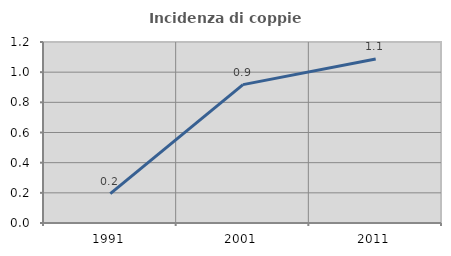
| Category | Incidenza di coppie miste |
|---|---|
| 1991.0 | 0.195 |
| 2001.0 | 0.917 |
| 2011.0 | 1.087 |